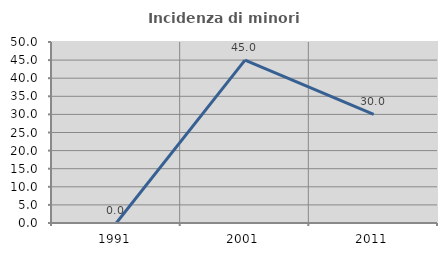
| Category | Incidenza di minori stranieri |
|---|---|
| 1991.0 | 0 |
| 2001.0 | 45 |
| 2011.0 | 30 |